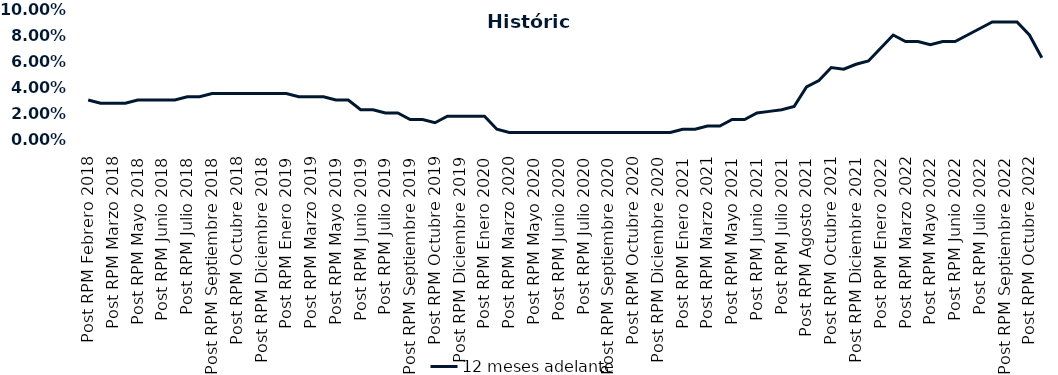
| Category | 12 meses adelante  |
|---|---|
| Post RPM Febrero 2018 | 0.03 |
| Pre RPM Marzo 2018 | 0.028 |
| Post RPM Marzo 2018 | 0.028 |
| Pre RPM Mayo 2018 | 0.028 |
| Post RPM Mayo 2018 | 0.03 |
| Pre RPM Junio 2018 | 0.03 |
| Post RPM Junio 2018 | 0.03 |
| Pre RPM Julio 2018 | 0.03 |
| Post RPM Julio 2018 | 0.032 |
| Pre RPM Septiembre 2018 | 0.032 |
| Post RPM Septiembre 2018 | 0.035 |
| Pre RPM Octubre 2018 | 0.035 |
| Post RPM Octubre 2018 | 0.035 |
| Pre RPM Diciembre 2018 | 0.035 |
| Post RPM Diciembre 2018 | 0.035 |
| Pre RPM Enero 2019 | 0.035 |
| Post RPM Enero 2019 | 0.035 |
| Pre RPM Marzo 2019 | 0.032 |
| Post RPM Marzo 2019 | 0.032 |
| Pre RPM Mayo 2019 | 0.032 |
| Post RPM Mayo 2019 | 0.03 |
| Pre RPM Junio 2019 | 0.03 |
| Post RPM Junio 2019 | 0.022 |
| Pre RPM Julio 2019 | 0.022 |
| Post RPM Julio 2019 | 0.02 |
| Pre RPM Septiembre 2019 | 0.02 |
| Post RPM Septiembre 2019 | 0.015 |
| Pre RPM Octubre 2019 | 0.015 |
| Post RPM Octubre 2019 | 0.012 |
| Pre RPM Diciembre 2019 | 0.018 |
| Post RPM Diciembre 2019 | 0.018 |
| Pre RPM Enero 2020 | 0.018 |
| Post RPM Enero 2020 | 0.018 |
| Pre RPM Marzo 2020 | 0.008 |
| Post RPM Marzo 2020 | 0.005 |
| Pre RPM Mayo 2020 | 0.005 |
| Post RPM Mayo 2020 | 0.005 |
| Pre RPM Junio 2020 | 0.005 |
| Post RPM Junio 2020 | 0.005 |
| Pre RPM Julio 2020 | 0.005 |
| Post RPM Julio 2020 | 0.005 |
| Pre RPM Septiembre 2020 | 0.005 |
| Post RPM Septiembre 2020 | 0.005 |
| Pre RPM Octubre 2020 | 0.005 |
| Post RPM Octubre 2020 | 0.005 |
| Pre RPM Diciembre 2020 | 0.005 |
| Post RPM Diciembre 2020 | 0.005 |
| Pre RPM Enero 2021 | 0.005 |
| Post RPM Enero 2021 | 0.008 |
| Pre RPM Marzo 2021 | 0.008 |
| Post RPM Marzo 2021 | 0.01 |
| Pre RPM Mayo 2021 | 0.01 |
| Post RPM Mayo 2021 | 0.015 |
| Pre RPM Junio 2021 | 0.015 |
| Post RPM Junio 2021 | 0.02 |
| Pre RPM Julio 2021 | 0.021 |
| Post RPM Julio 2021 | 0.022 |
| Pre RPM Agosto 2021 | 0.025 |
| Post RPM Agosto 2021 | 0.04 |
| Pre RPM Octubre 2021 | 0.045 |
| Post RPM Octubre 2021 | 0.055 |
| Pre RPM Diciembre 2021 | 0.054 |
| Post RPM Diciembre 2021 | 0.058 |
| Pre RPM Enero 2022 | 0.06 |
| Post RPM Enero 2022 | 0.07 |
| Pre RPM Marzo 2022 | 0.08 |
| Post RPM Marzo 2022 | 0.075 |
| Pre RPM Mayo 2022 | 0.075 |
| Post RPM Mayo 2022 | 0.072 |
| Pre RPM Junio 2022 | 0.075 |
| Post RPM Junio 2022 | 0.075 |
| Pre RPM Julio 2022 | 0.08 |
| Post RPM Julio 2022 | 0.085 |
| Pre RPM Septiembre 2022 | 0.09 |
| Post RPM Septiembre 2022 | 0.09 |
| Pre RPM Octubre 2022 | 0.09 |
| Post RPM Octubre 2022 | 0.08 |
| Pre RPM Diciembre 2022 | 0.062 |